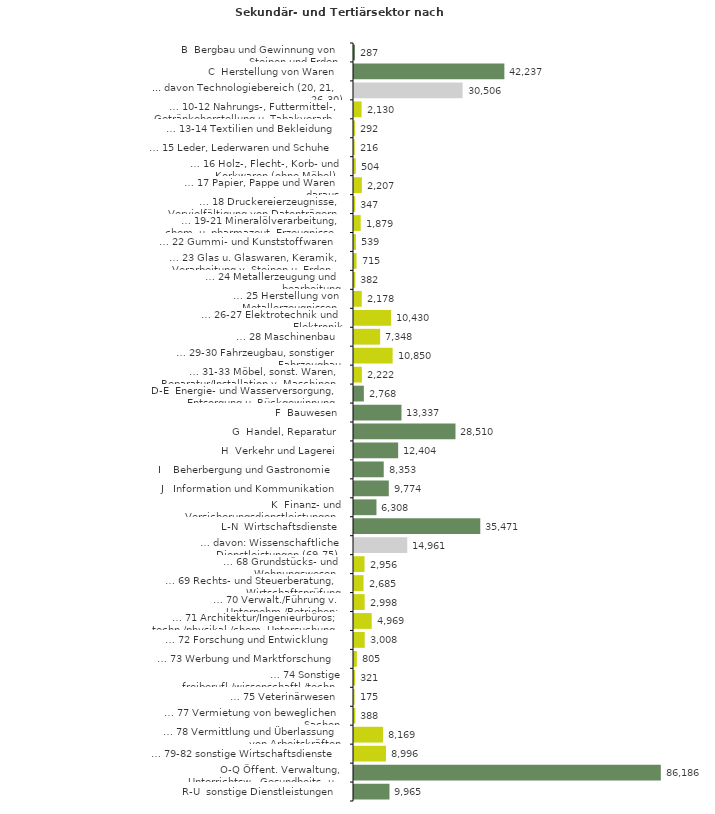
| Category | Series 0 |
|---|---|
| B  Bergbau und Gewinnung von Steinen und Erden | 287 |
| C  Herstellung von Waren | 42237 |
| ... davon Technologiebereich (20, 21, 26-30) | 30506 |
| … 10-12 Nahrungs-, Futtermittel-, Getränkeherstellung u. Tabakverarb. | 2130 |
| … 13-14 Textilien und Bekleidung | 292 |
| … 15 Leder, Lederwaren und Schuhe | 216 |
| … 16 Holz-, Flecht-, Korb- und Korkwaren (ohne Möbel)  | 504 |
| … 17 Papier, Pappe und Waren daraus  | 2207 |
| … 18 Druckereierzeugnisse, Vervielfältigung von Datenträgern | 347 |
| … 19-21 Mineralölverarbeitung, chem. u. pharmazeut. Erzeugnisse | 1879 |
| … 22 Gummi- und Kunststoffwaren | 539 |
| … 23 Glas u. Glaswaren, Keramik, Verarbeitung v. Steinen u. Erden  | 715 |
| … 24 Metallerzeugung und -bearbeitung | 382 |
| … 25 Herstellung von Metallerzeugnissen  | 2178 |
| … 26-27 Elektrotechnik und Elektronik | 10430 |
| … 28 Maschinenbau | 7348 |
| … 29-30 Fahrzeugbau, sonstiger Fahrzeugbau | 10850 |
| … 31-33 Möbel, sonst. Waren, Reparatur/Installation v. Maschinen | 2222 |
| D-E  Energie- und Wasserversorgung, Entsorgung u. Rückgewinnung | 2768 |
| F  Bauwesen | 13337 |
| G  Handel, Reparatur | 28510 |
| H  Verkehr und Lagerei | 12404 |
| I    Beherbergung und Gastronomie | 8353 |
| J   Information und Kommunikation | 9774 |
| K  Finanz- und Versicherungsdienstleistungen | 6308 |
| L-N  Wirtschaftsdienste | 35471 |
| … davon: Wissenschaftliche Dienstleistungen (69-75) | 14961 |
| … 68 Grundstücks- und Wohnungswesen  | 2956 |
| … 69 Rechts- und Steuerberatung, Wirtschaftsprüfung | 2685 |
| … 70 Verwalt./Führung v. Unternehm./Betrieben; Unternehmensberat. | 2998 |
| … 71 Architektur/Ingenieurbüros; techn./physikal./chem. Untersuchung | 4969 |
| … 72 Forschung und Entwicklung  | 3008 |
| … 73 Werbung und Marktforschung | 805 |
| … 74 Sonstige freiberufl./wissenschaftl./techn. Tätigkeiten | 321 |
| … 75 Veterinärwesen | 175 |
| … 77 Vermietung von beweglichen Sachen  | 388 |
| … 78 Vermittlung und Überlassung von Arbeitskräften | 8169 |
| … 79-82 sonstige Wirtschaftsdienste | 8996 |
| O-Q Öffent. Verwaltung, Unterrichtsw., Gesundheits- u. Sozialwesen | 86186 |
| R-U  sonstige Dienstleistungen | 9965 |